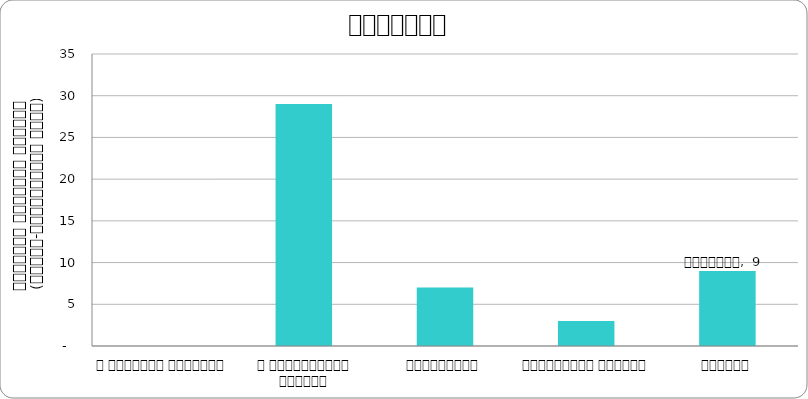
| Category | कुटनीति |
|---|---|
| द हिमालयन टाइम्स् | 0 |
| द काठमाण्डौं पोस्ट् | 29 |
| कान्तिपुर | 7 |
| अन्नपूर्ण पोस्ट् | 3 |
| नागरिक | 9 |